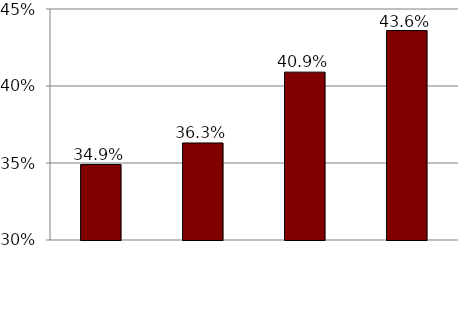
| Category | Series 0 |
|---|---|
| 1985 (actual) | 0.349 |
| 2010 predicted using 1985 rates by age | 0.363 |
| 2010 predicted using 1985 rates by age and schooling | 0.409 |
| 2010 (actual) | 0.436 |